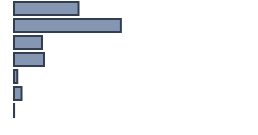
| Category | Percentatge |
|---|---|
| 0 | 26.873 |
| 1 | 44.533 |
| 2 | 11.627 |
| 3 | 12.456 |
| 4 | 1.367 |
| 5 | 3.111 |
| 6 | 0.032 |